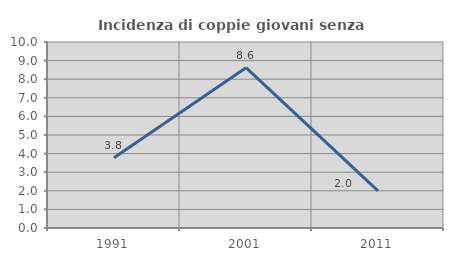
| Category | Incidenza di coppie giovani senza figli |
|---|---|
| 1991.0 | 3.774 |
| 2001.0 | 8.621 |
| 2011.0 | 2 |